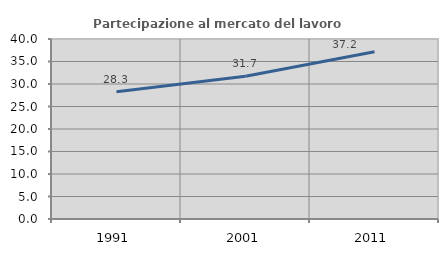
| Category | Partecipazione al mercato del lavoro  femminile |
|---|---|
| 1991.0 | 28.27 |
| 2001.0 | 31.718 |
| 2011.0 | 37.184 |